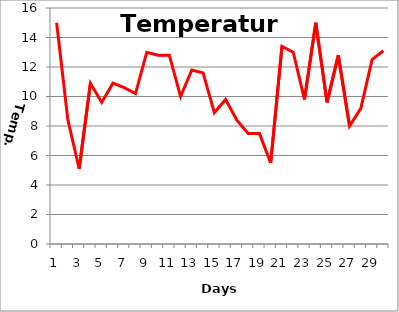
| Category | Series 0 |
|---|---|
| 0 | 15 |
| 1 | 8.4 |
| 2 | 5.1 |
| 3 | 10.9 |
| 4 | 9.6 |
| 5 | 10.9 |
| 6 | 10.6 |
| 7 | 10.2 |
| 8 | 13 |
| 9 | 12.8 |
| 10 | 12.8 |
| 11 | 10 |
| 12 | 11.8 |
| 13 | 11.6 |
| 14 | 8.9 |
| 15 | 9.8 |
| 16 | 8.4 |
| 17 | 7.5 |
| 18 | 7.5 |
| 19 | 5.5 |
| 20 | 13.4 |
| 21 | 13 |
| 22 | 9.8 |
| 23 | 15 |
| 24 | 9.6 |
| 25 | 12.8 |
| 26 | 8 |
| 27 | 9.2 |
| 28 | 12.5 |
| 29 | 13.1 |